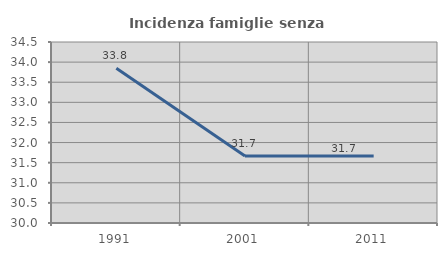
| Category | Incidenza famiglie senza nuclei |
|---|---|
| 1991.0 | 33.846 |
| 2001.0 | 31.667 |
| 2011.0 | 31.667 |